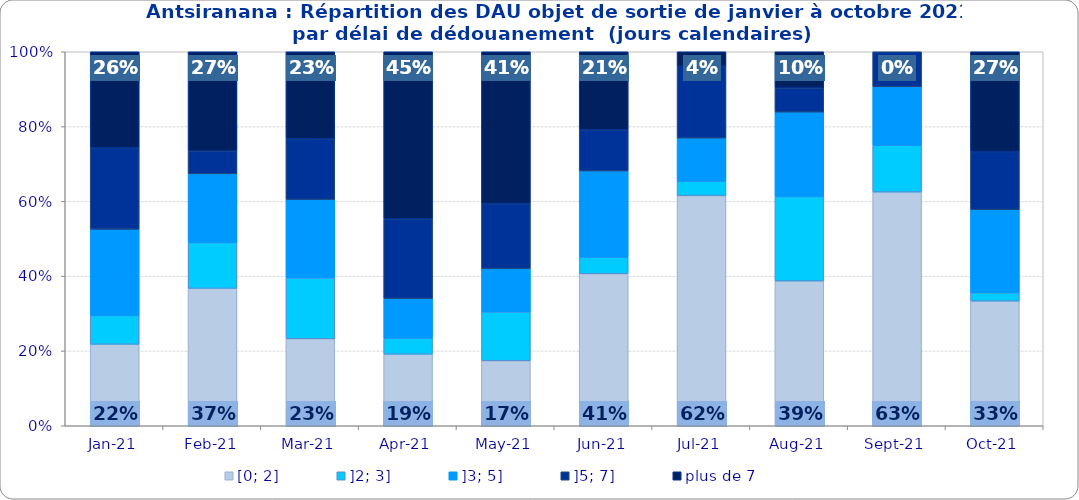
| Category | [0; 2] | ]2; 3] | ]3; 5] | ]5; 7] | plus de 7 |
|---|---|---|---|---|---|
| 2021-01-01 | 0.218 | 0.077 | 0.231 | 0.218 | 0.256 |
| 2021-02-01 | 0.367 | 0.122 | 0.184 | 0.061 | 0.265 |
| 2021-03-01 | 0.233 | 0.163 | 0.209 | 0.163 | 0.233 |
| 2021-04-01 | 0.191 | 0.043 | 0.106 | 0.213 | 0.447 |
| 2021-05-01 | 0.174 | 0.13 | 0.116 | 0.174 | 0.406 |
| 2021-06-01 | 0.407 | 0.044 | 0.231 | 0.11 | 0.209 |
| 2021-07-01 | 0.615 | 0.038 | 0.115 | 0.192 | 0.038 |
| 2021-08-01 | 0.387 | 0.226 | 0.226 | 0.065 | 0.097 |
| 2021-09-01 | 0.625 | 0.125 | 0.156 | 0.094 | 0 |
| 2021-10-01 | 0.333 | 0.022 | 0.222 | 0.156 | 0.267 |